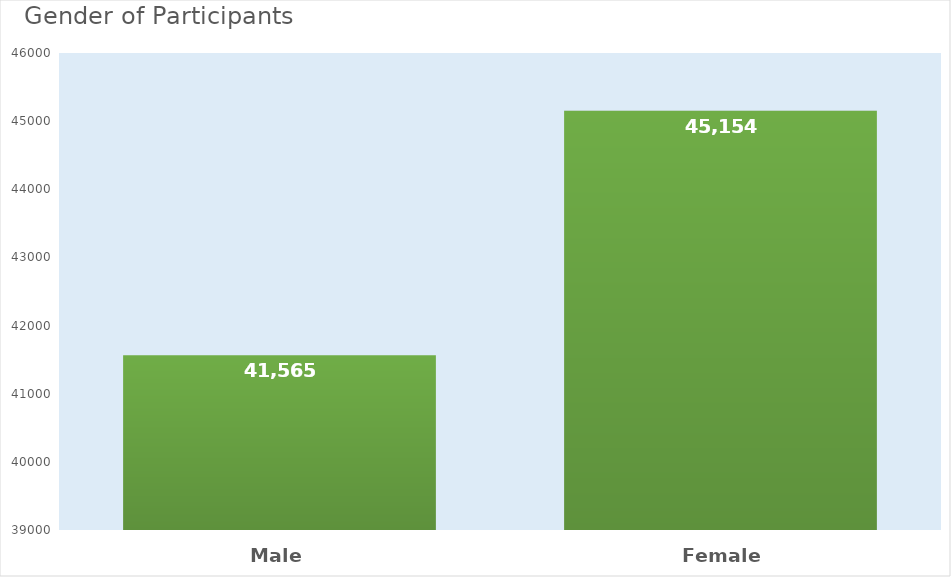
| Category | Series 0 |
|---|---|
| Male | 41565 |
| Female | 45154 |